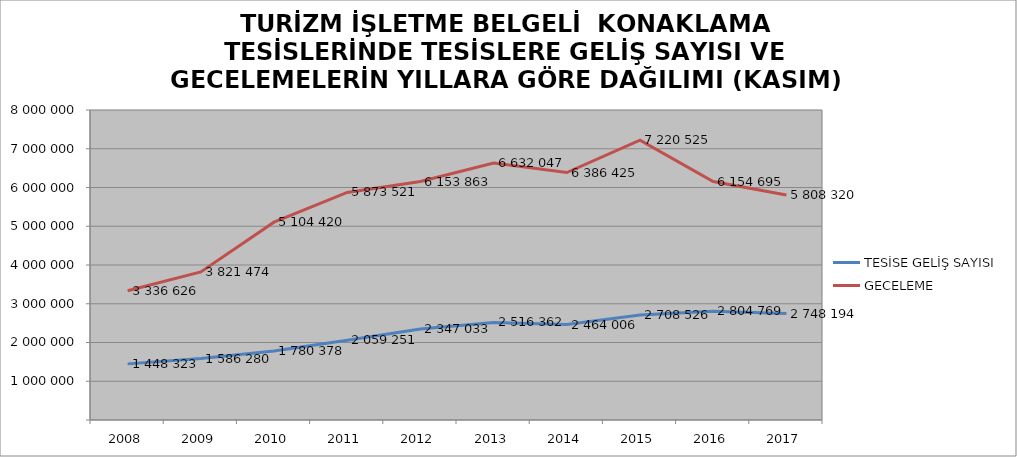
| Category | TESİSE GELİŞ SAYISI | GECELEME |
|---|---|---|
| 2008 | 1448323 | 3336626 |
| 2009 | 1586280 | 3821474 |
| 2010 | 1780378 | 5104420 |
| 2011 | 2059251 | 5873521 |
| 2012 | 2347033 | 6153863 |
| 2013 | 2516362 | 6632047 |
| 2014 | 2464006 | 6386425 |
| 2015 | 2708526 | 7220525 |
| 2016 | 2804769 | 6154695 |
| 2017 | 2748194 | 5808320 |